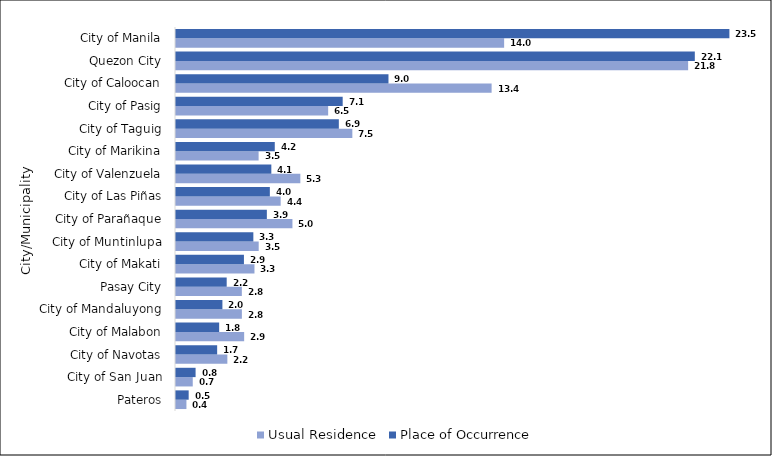
| Category |  Usual Residence  |  Place of Occurrence  |
|---|---|---|
|  Pateros | 0.444 | 0.539 |
|  City of San Juan | 0.712 | 0.833 |
|  City of Navotas | 2.183 | 1.75 |
|  City of Malabon | 2.898 | 1.835 |
|  City of Mandaluyong | 2.801 | 1.973 |
|  Pasay City | 2.799 | 2.155 |
|  City of Makati | 3.337 | 2.888 |
|  City of Muntinlupa | 3.516 | 3.289 |
|  City of Parañaque | 4.951 | 3.863 |
|  City of Las Piñas | 4.45 | 3.99 |
|  City of Valenzuela | 5.286 | 4.054 |
|  City of Marikina | 3.512 | 4.2 |
|  City of Taguig | 7.498 | 6.923 |
|  City of Pasig | 6.469 | 7.087 |
|  City of Caloocan | 13.419 | 9.034 |
|  Quezon City | 21.774 | 22.058 |
|  City of Manila | 13.951 | 23.529 |